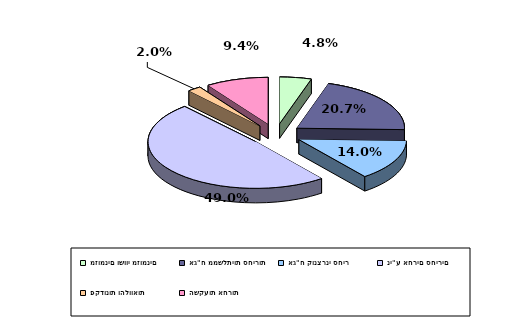
| Category | Series 0 |
|---|---|
| מזומנים ושווי מזומנים | 0.048 |
| אג"ח ממשלתיות סחירות | 0.207 |
| אג"ח קונצרני סחיר | 0.14 |
| ני"ע אחרים סחירים | 0.49 |
| פקדונות והלוואות | 0.02 |
| השקעות אחרות | 0.094 |